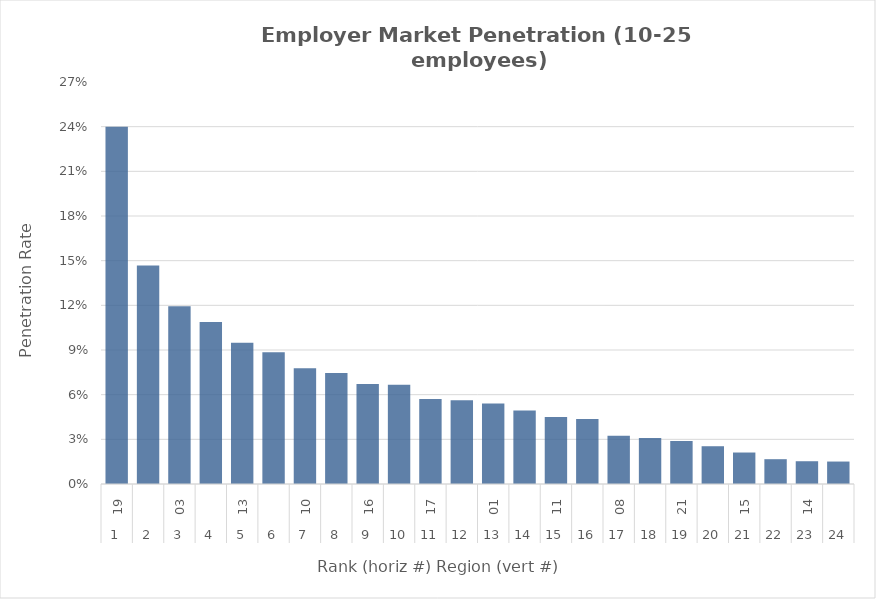
| Category | Rate |
|---|---|
| 0 | 0.24 |
| 1 | 0.147 |
| 2 | 0.119 |
| 3 | 0.109 |
| 4 | 0.095 |
| 5 | 0.088 |
| 6 | 0.078 |
| 7 | 0.075 |
| 8 | 0.067 |
| 9 | 0.067 |
| 10 | 0.057 |
| 11 | 0.056 |
| 12 | 0.054 |
| 13 | 0.049 |
| 14 | 0.045 |
| 15 | 0.044 |
| 16 | 0.032 |
| 17 | 0.031 |
| 18 | 0.029 |
| 19 | 0.025 |
| 20 | 0.021 |
| 21 | 0.017 |
| 22 | 0.015 |
| 23 | 0.015 |